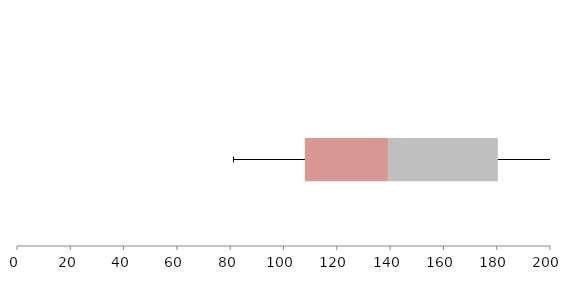
| Category | Series 1 | Series 2 | Series 3 |
|---|---|---|---|
| 0 | 108.034 | 31.42 | 40.969 |